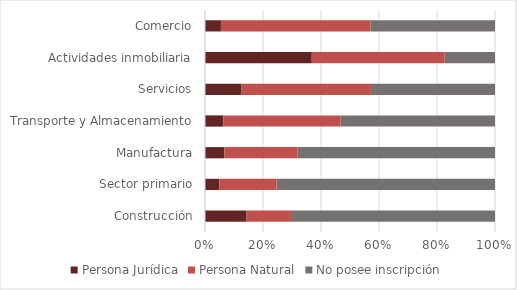
| Category | Persona Jurídica | Persona Natural | No posee inscripción |
|---|---|---|---|
| Construcción | 0.144 | 0.153 | 0.704 |
| Sector primario | 0.049 | 0.198 | 0.753 |
| Manufactura | 0.067 | 0.253 | 0.68 |
| Transporte y Almacenamiento | 0.063 | 0.405 | 0.532 |
| Servicios | 0.126 | 0.446 | 0.428 |
| Actividades inmobiliaria | 0.368 | 0.458 | 0.174 |
| Comercio | 0.055 | 0.515 | 0.43 |